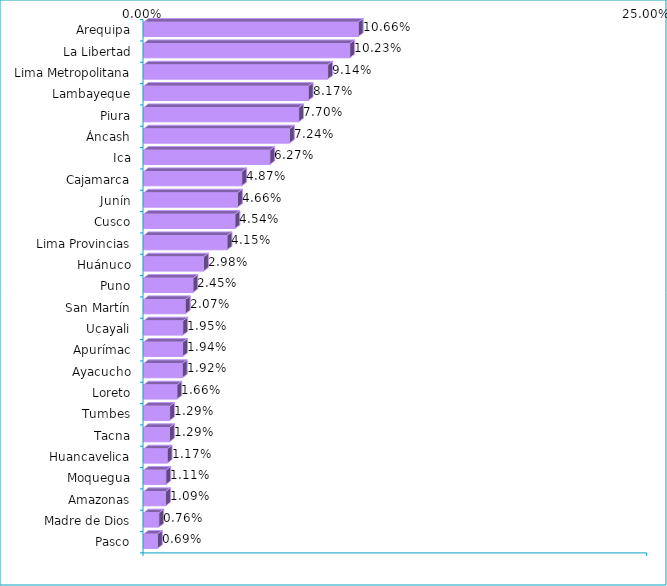
| Category | Series 0 |
|---|---|
| Arequipa | 0.107 |
| La Libertad | 0.102 |
| Lima Metropolitana | 0.091 |
| Lambayeque | 0.082 |
| Piura | 0.077 |
| Áncash | 0.072 |
| Ica | 0.063 |
| Cajamarca | 0.049 |
| Junín | 0.047 |
| Cusco | 0.045 |
| Lima Provincias | 0.041 |
| Huánuco | 0.03 |
| Puno | 0.025 |
| San Martín | 0.021 |
| Ucayali | 0.019 |
| Apurímac | 0.019 |
| Ayacucho | 0.019 |
| Loreto | 0.017 |
| Tumbes | 0.013 |
| Tacna | 0.013 |
| Huancavelica | 0.012 |
| Moquegua | 0.011 |
| Amazonas | 0.011 |
| Madre de Dios | 0.008 |
| Pasco | 0.007 |